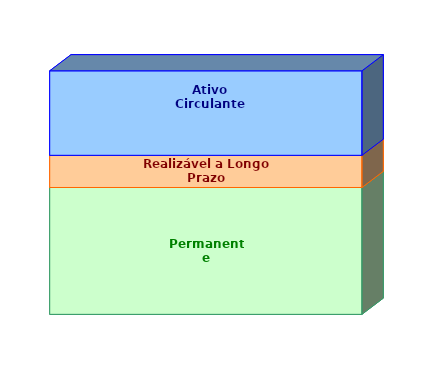
| Category | Permanente | Realizável a Longo Prazo | Ativo Circulante |
|---|---|---|---|
| 0 | 0.521 | 0.132 | 0.347 |